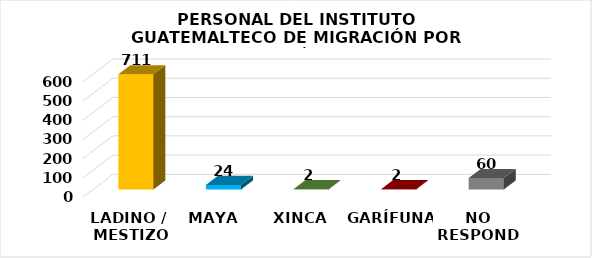
| Category | Series 0 |
|---|---|
| LADINO /
 MESTIZO | 711 |
| MAYA | 24 |
| XINCA | 2 |
| GARÍFUNA | 2 |
| NO RESPONDE | 60 |